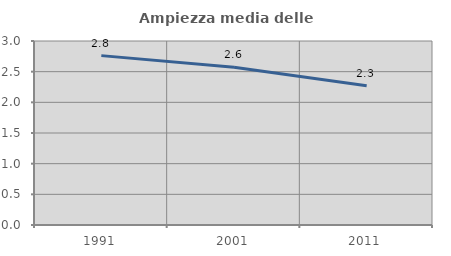
| Category | Ampiezza media delle famiglie |
|---|---|
| 1991.0 | 2.761 |
| 2001.0 | 2.573 |
| 2011.0 | 2.27 |